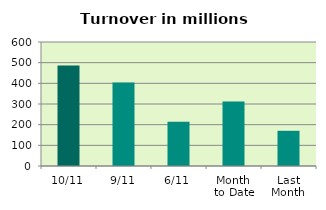
| Category | Series 0 |
|---|---|
| 10/11 | 486.158 |
| 9/11 | 403.474 |
| 6/11 | 213.652 |
| Month 
to Date | 311.533 |
| Last
Month | 170.355 |